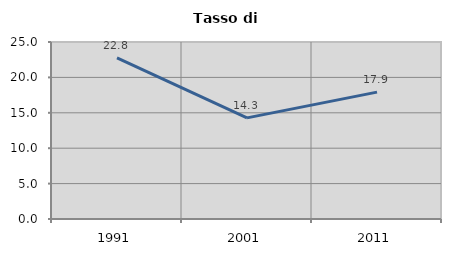
| Category | Tasso di disoccupazione   |
|---|---|
| 1991.0 | 22.764 |
| 2001.0 | 14.286 |
| 2011.0 | 17.919 |